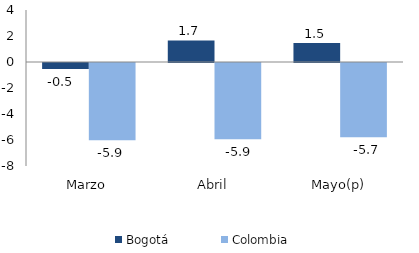
| Category | Bogotá | Colombia |
|---|---|---|
| Marzo | -0.453 | -5.937 |
| Abril | 1.662 | -5.864 |
| Mayo(p) | 1.466 | -5.705 |